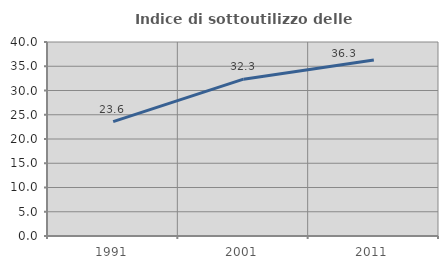
| Category | Indice di sottoutilizzo delle abitazioni  |
|---|---|
| 1991.0 | 23.569 |
| 2001.0 | 32.336 |
| 2011.0 | 36.275 |